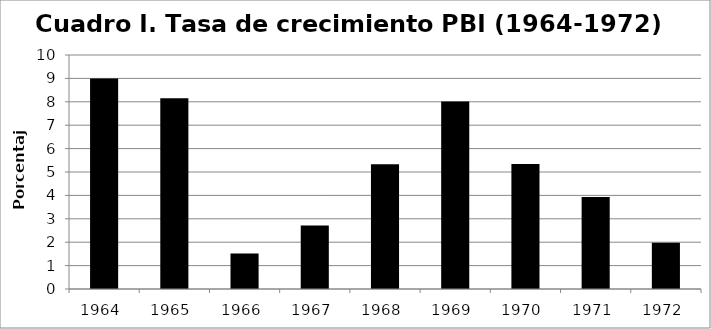
| Category | Tasa de crecimiento anual |
|---|---|
| 1964.0 | 9 |
| 1965.0 | 8.155 |
| 1966.0 | 1.514 |
| 1967.0 | 2.715 |
| 1968.0 | 5.328 |
| 1969.0 | 8.018 |
| 1970.0 | 5.346 |
| 1971.0 | 3.934 |
| 1972.0 | 1.978 |